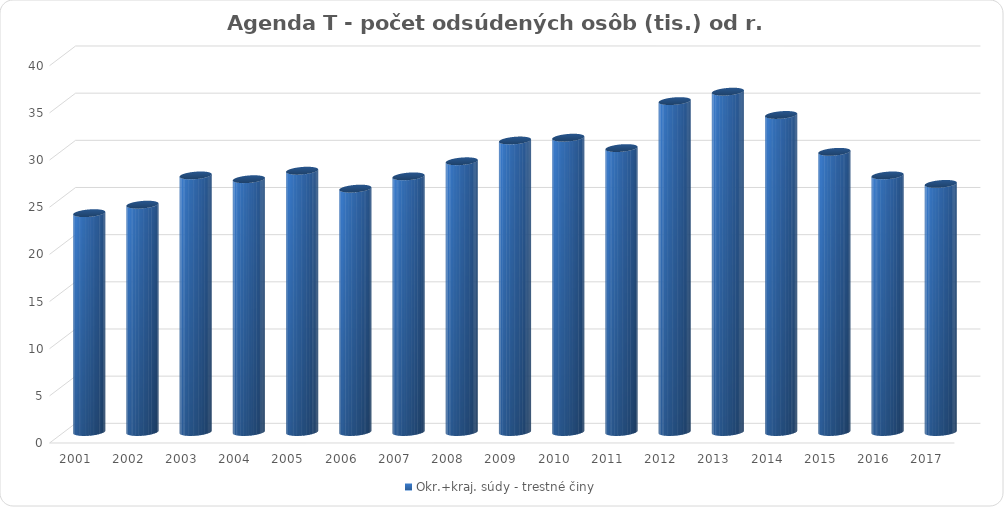
| Category | Okr.+kraj. súdy - trestné činy |
|---|---|
| 2001.0 | 23.2 |
| 2002.0 | 24.1 |
| 2003.0 | 27.2 |
| 2004.0 | 26.8 |
| 2005.0 | 27.7 |
| 2006.0 | 25.8 |
| 2007.0 | 27.1 |
| 2008.0 | 28.7 |
| 2009.0 | 30.9 |
| 2010.0 | 31.2 |
| 2011.0 | 30.1 |
| 2012.0 | 35.08 |
| 2013.0 | 36.079 |
| 2014.0 | 33.61 |
| 2015.0 | 29.7 |
| 2016.0 | 27.2 |
| 2017.0 | 26.3 |